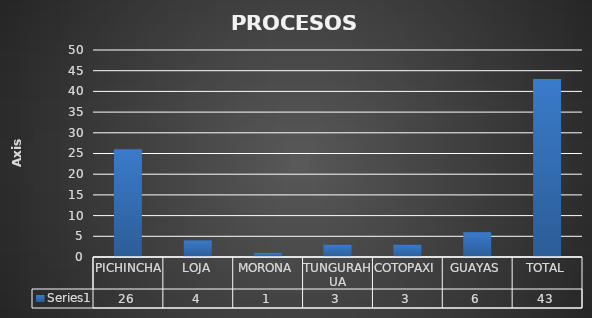
| Category | Series 0 |
|---|---|
| PICHINCHA | 26 |
| LOJA | 4 |
| MORONA | 1 |
| TUNGURAHUA | 3 |
| COTOPAXI | 3 |
| GUAYAS | 6 |
| TOTAL | 43 |